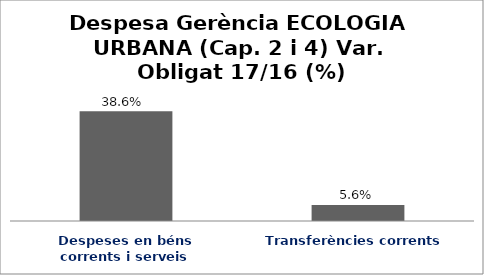
| Category | Series 0 |
|---|---|
| Despeses en béns corrents i serveis | 0.386 |
| Transferències corrents | 0.056 |